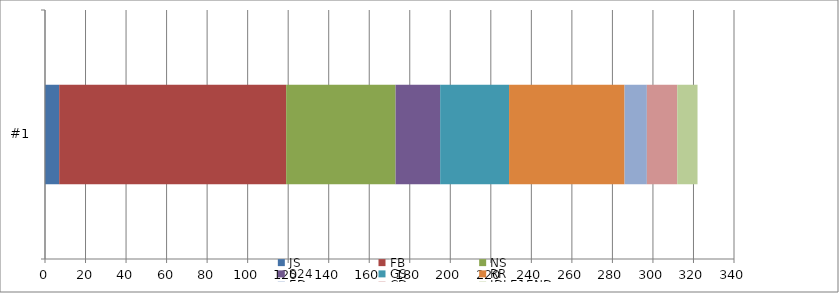
| Category | JS | FB | NS | S24 | GS | RR | ED | CD | IDLE1END |
|---|---|---|---|---|---|---|---|---|---|
| #1 | 7 | 112 | 54 | 22 | 34 | 57 | 11 | 15 | 10 |